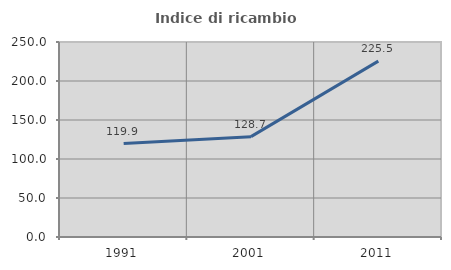
| Category | Indice di ricambio occupazionale  |
|---|---|
| 1991.0 | 119.868 |
| 2001.0 | 128.662 |
| 2011.0 | 225.455 |